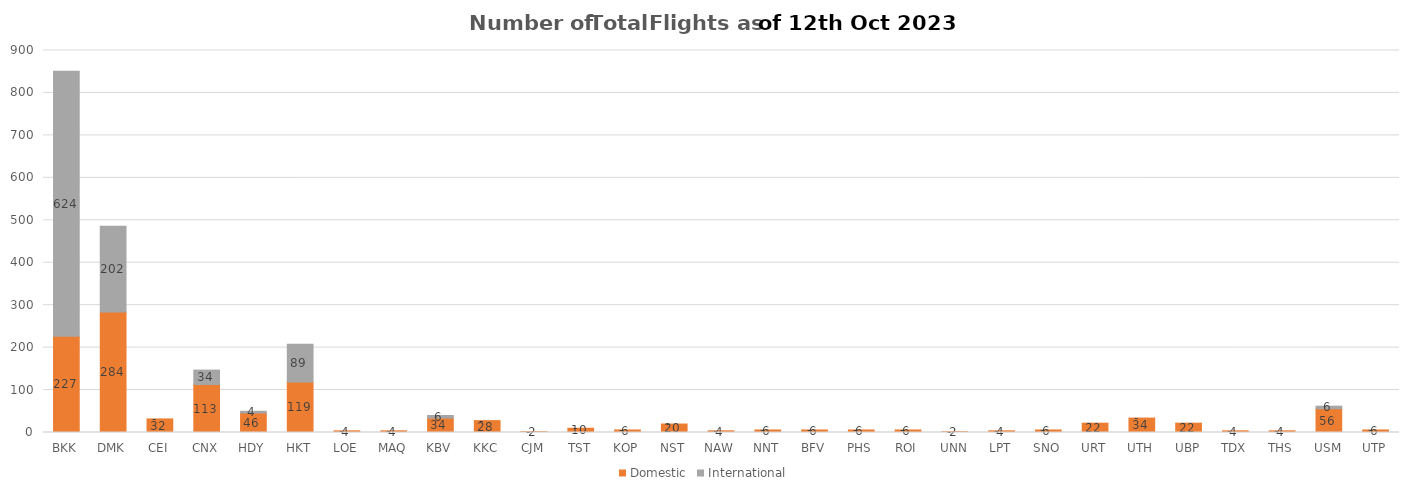
| Category | Domestic | International |
|---|---|---|
| BKK | 227 | 624 |
| DMK | 284 | 202 |
| CEI | 32 | 0 |
| CNX | 113 | 34 |
| HDY | 46 | 4 |
| HKT | 119 | 89 |
| LOE | 4 | 0 |
| MAQ | 4 | 0 |
| KBV | 34 | 6 |
| KKC | 28 | 0 |
| CJM | 2 | 0 |
| TST | 10 | 0 |
| KOP | 6 | 0 |
| NST | 20 | 0 |
| NAW | 4 | 0 |
| NNT | 6 | 0 |
| BFV | 6 | 0 |
| PHS | 6 | 0 |
| ROI | 6 | 0 |
| UNN | 2 | 0 |
| LPT | 4 | 0 |
| SNO | 6 | 0 |
| URT | 22 | 0 |
| UTH | 34 | 0 |
| UBP | 22 | 0 |
| TDX | 4 | 0 |
| THS | 4 | 0 |
| USM | 56 | 6 |
| UTP | 6 | 0 |